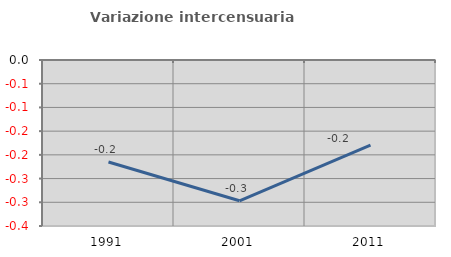
| Category | Variazione intercensuaria annua |
|---|---|
| 1991.0 | -0.215 |
| 2001.0 | -0.297 |
| 2011.0 | -0.179 |